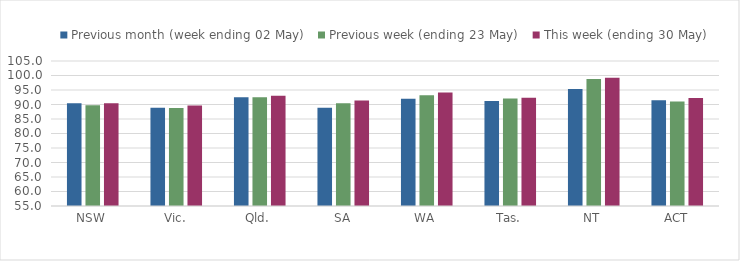
| Category | Previous month (week ending 02 May) | Previous week (ending 23 May) | This week (ending 30 May) |
|---|---|---|---|
| NSW | 90.453 | 89.726 | 90.432 |
| Vic. | 88.857 | 88.803 | 89.662 |
| Qld. | 92.461 | 92.516 | 93.011 |
| SA | 88.84 | 90.467 | 91.339 |
| WA | 92.004 | 93.211 | 94.099 |
| Tas. | 91.192 | 92.031 | 92.344 |
| NT | 95.327 | 98.832 | 99.259 |
| ACT | 91.46 | 91.036 | 92.239 |